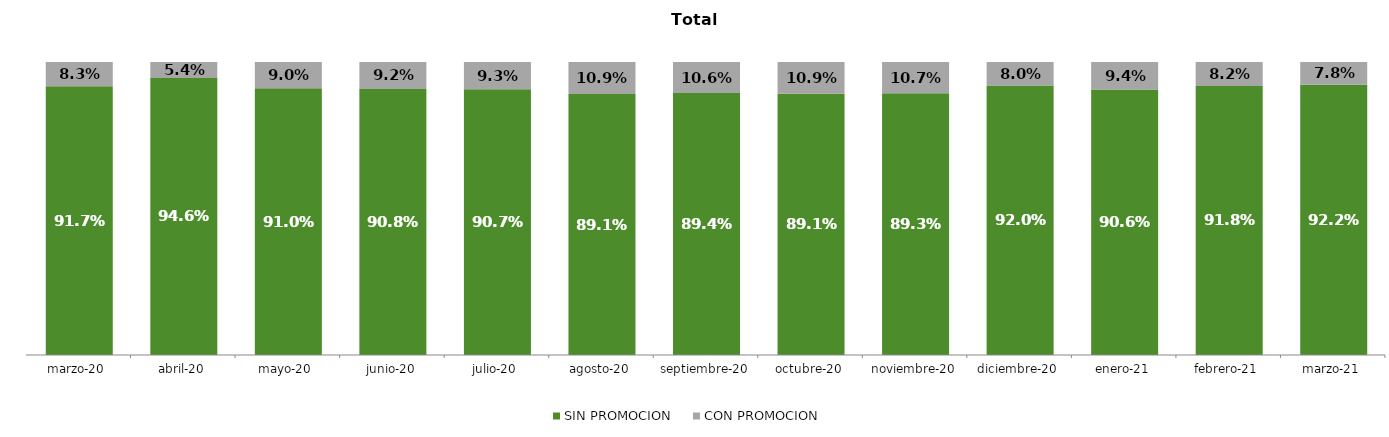
| Category | SIN PROMOCION   | CON PROMOCION   |
|---|---|---|
| 2020-03-01 | 0.917 | 0.083 |
| 2020-04-01 | 0.946 | 0.054 |
| 2020-05-01 | 0.91 | 0.09 |
| 2020-06-01 | 0.908 | 0.092 |
| 2020-07-01 | 0.907 | 0.093 |
| 2020-08-01 | 0.891 | 0.109 |
| 2020-09-01 | 0.894 | 0.106 |
| 2020-10-01 | 0.891 | 0.109 |
| 2020-11-01 | 0.893 | 0.107 |
| 2020-12-01 | 0.92 | 0.08 |
| 2021-01-01 | 0.906 | 0.094 |
| 2021-02-01 | 0.918 | 0.082 |
| 2021-03-01 | 0.922 | 0.078 |